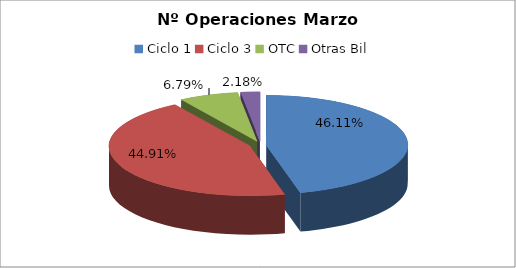
| Category | Series 0 |
|---|---|
| Ciclo 1 | 53722 |
| Ciclo 3 | 52322 |
| OTC | 7916 |
| Otras Bil | 2543 |